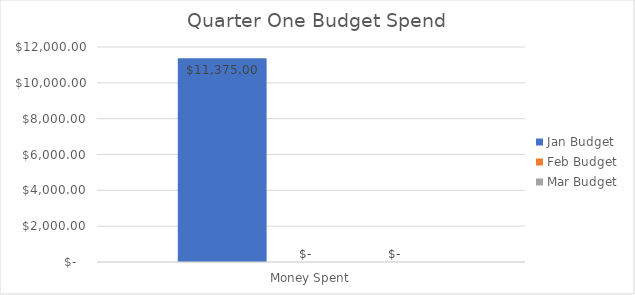
| Category | Jan Budget | Feb Budget | Mar Budget |
|---|---|---|---|
| 0 | 11375 | 0 | 0 |